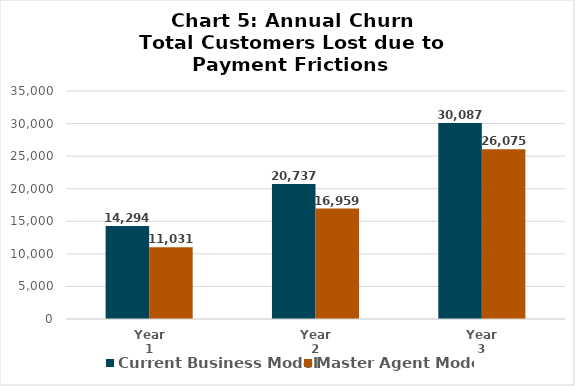
| Category | Current Business Model | Master Agent Model |
|---|---|---|
| Year 1 | 14294.215 | 11030.825 |
| Year 2 | 20737.048 | 16958.871 |
| Year 3 | 30086.919 | 26075.258 |